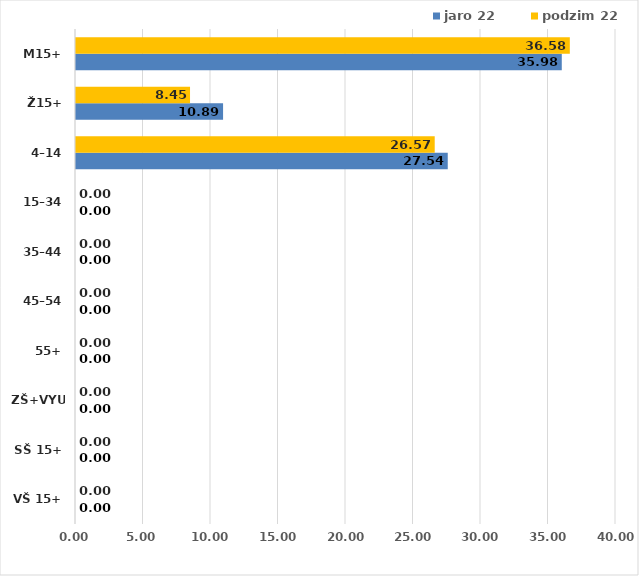
| Category | jaro 22 | podzim 22 |
|---|---|---|
| VŠ 15+ | 0 | 0 |
| SŠ 15+ | 0 | 0 |
| ZŠ+VYUČ | 0 | 0 |
| 55+ | 0 | 0 |
| 45–54 | 0 | 0 |
| 35–44 | 0 | 0 |
| 15–34 | 0 | 0 |
| 4–14 | 27.538 | 26.571 |
| Ž15+ | 10.894 | 8.446 |
| M15+ | 35.983 | 36.58 |